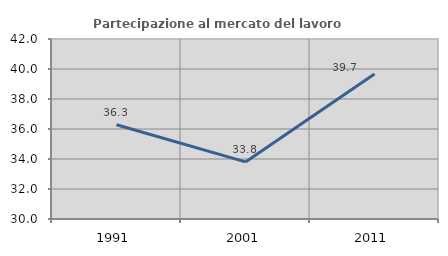
| Category | Partecipazione al mercato del lavoro  femminile |
|---|---|
| 1991.0 | 36.285 |
| 2001.0 | 33.806 |
| 2011.0 | 39.667 |